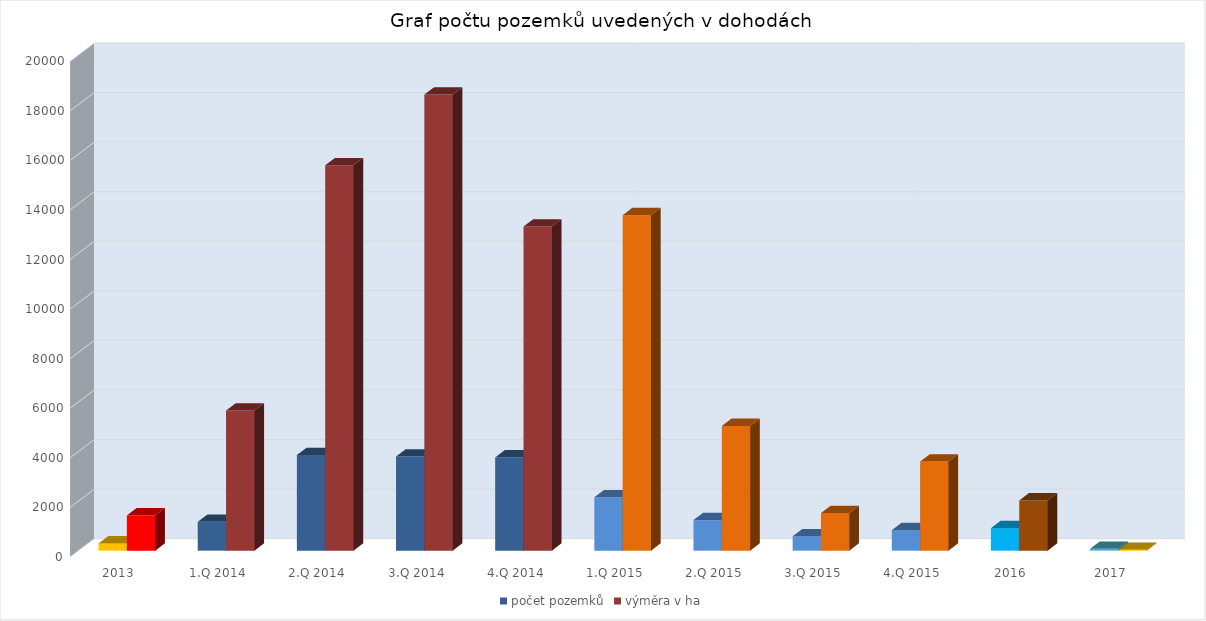
| Category | počet pozemků | výměra v ha |
|---|---|---|
| 2013 | 293 | 1422 |
| 1.Q 2014 | 1164 | 5651 |
| 2.Q 2014 | 3860 | 15549 |
| 3.Q 2014 | 3800 | 18406 |
| 4.Q 2014 | 3763 | 13077 |
| 1.Q 2015 | 2154 | 13537 |
| 2.Q 2015 | 1234 | 5032 |
| 3.Q 2015 | 583 | 1518 |
| 4.Q 2015 | 826 | 3597 |
| 2016 | 907 | 2027 |
| 2017 | 77 | 32 |